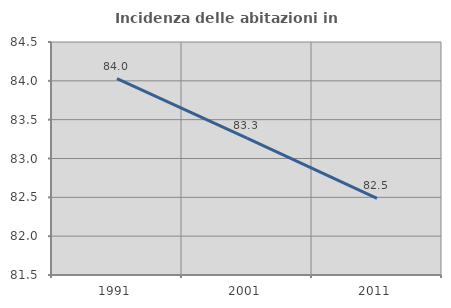
| Category | Incidenza delle abitazioni in proprietà  |
|---|---|
| 1991.0 | 84.029 |
| 2001.0 | 83.264 |
| 2011.0 | 82.486 |